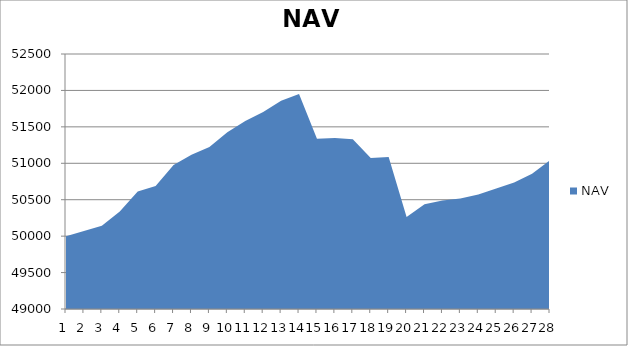
| Category | NAV |
|---|---|
| 0 | 50000 |
| 1 | 50069.444 |
| 2 | 50142.343 |
| 3 | 50336.57 |
| 4 | 50612.255 |
| 5 | 50687.913 |
| 6 | 50975.413 |
| 7 | 51115.874 |
| 8 | 51223.542 |
| 9 | 51427.364 |
| 10 | 51580.567 |
| 11 | 51704.692 |
| 12 | 51858.016 |
| 13 | 51951.766 |
| 14 | 51336.067 |
| 15 | 51345.356 |
| 16 | 51328.667 |
| 17 | 51072.985 |
| 18 | 51085.199 |
| 19 | 50261.67 |
| 20 | 50438.394 |
| 21 | 50489.896 |
| 22 | 50518.251 |
| 23 | 50572.468 |
| 24 | 50655.55 |
| 25 | 50737.787 |
| 26 | 50856.035 |
| 27 | 51041.806 |